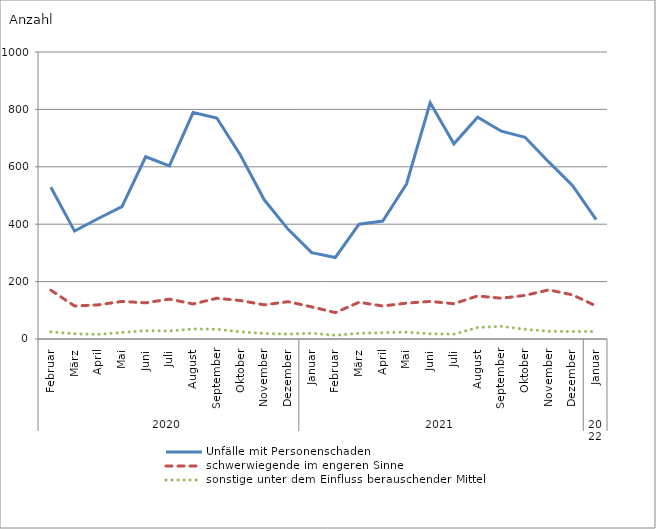
| Category | Unfälle mit Personenschaden | schwerwiegende im engeren Sinne | sonstige unter dem Einfluss berauschender Mittel |
|---|---|---|---|
| 0 | 529 | 170 | 25 |
| 1 | 376 | 115 | 18 |
| 2 | 420 | 119 | 16 |
| 3 | 461 | 131 | 23 |
| 4 | 635 | 126 | 29 |
| 5 | 603 | 139 | 28 |
| 6 | 789 | 122 | 35 |
| 7 | 770 | 142 | 34 |
| 8 | 640 | 134 | 25 |
| 9 | 485 | 119 | 19 |
| 10 | 383 | 130 | 17 |
| 11 | 301 | 112 | 20 |
| 12 | 284 | 92 | 13 |
| 13 | 400 | 128 | 20 |
| 14 | 411 | 115 | 22 |
| 15 | 540 | 125 | 24 |
| 16 | 823 | 131 | 18 |
| 17 | 680 | 123 | 17 |
| 18 | 773 | 150 | 40 |
| 19 | 724 | 142 | 44 |
| 20 | 703 | 152 | 34 |
| 21 | 617 | 171 | 27 |
| 22 | 535 | 154 | 26 |
| 23 | 416 | 115 | 26 |